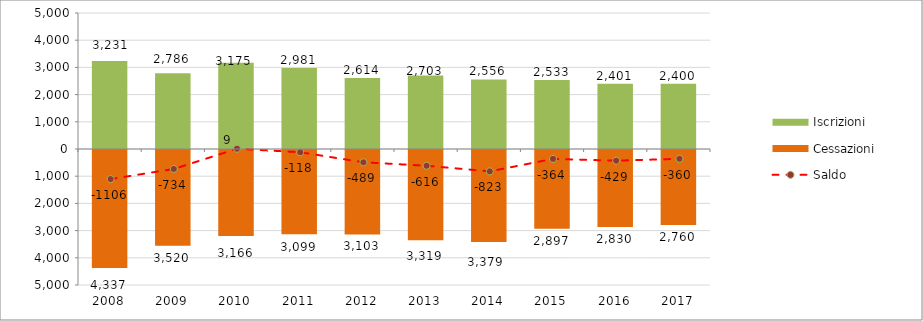
| Category | Iscrizioni | Cessazioni |
|---|---|---|
| 2008.0 | 3231 | -4337 |
| 2009.0 | 2786 | -3520 |
| 2010.0 | 3175 | -3166 |
| 2011.0 | 2981 | -3099 |
| 2012.0 | 2614 | -3103 |
| 2013.0 | 2703 | -3319 |
| 2014.0 | 2556 | -3379 |
| 2015.0 | 2533 | -2897 |
| 2016.0 | 2401 | -2830 |
| 2017.0 | 2400 | -2760 |